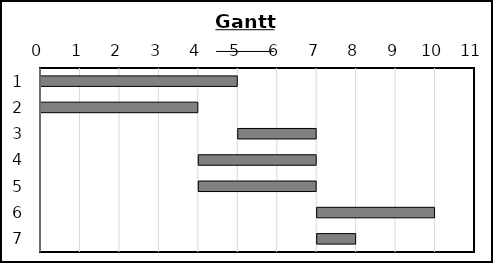
| Category | Series 0 | Series 1 |
|---|---|---|
| 0 | 0 | 5 |
| 1 | 0 | 4 |
| 2 | 5 | 2 |
| 3 | 4 | 3 |
| 4 | 4 | 3 |
| 5 | 7 | 3 |
| 6 | 7 | 1 |